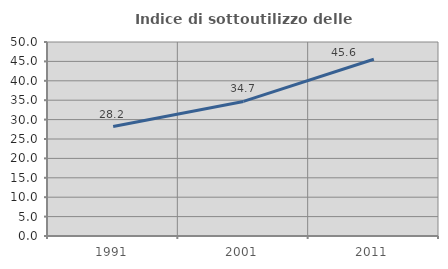
| Category | Indice di sottoutilizzo delle abitazioni  |
|---|---|
| 1991.0 | 28.204 |
| 2001.0 | 34.689 |
| 2011.0 | 45.552 |